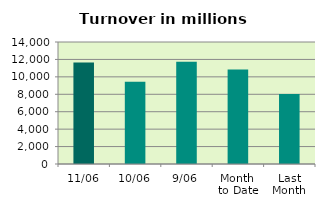
| Category | Series 0 |
|---|---|
| 11/06 | 11637.449 |
| 10/06 | 9434.046 |
| 9/06 | 11737.409 |
| Month 
to Date | 10855.521 |
| Last
Month | 8023.22 |